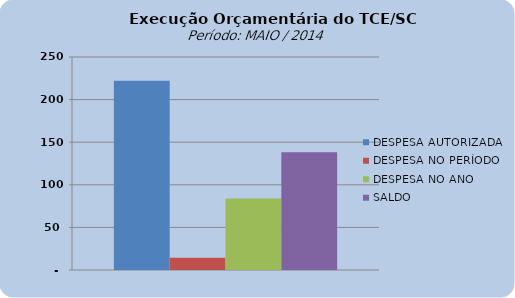
| Category | DESPESA AUTORIZADA | DESPESA NO PERÍODO | DESPESA NO ANO | SALDO |
|---|---|---|---|---|
| 0 | 222065628.97 | 14245719.67 | 83802560.35 | 138263068.62 |